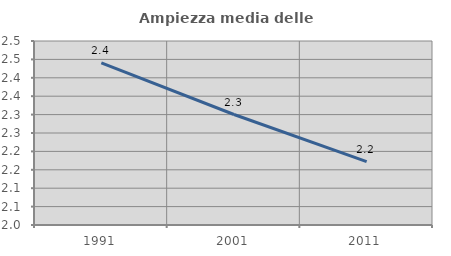
| Category | Ampiezza media delle famiglie |
|---|---|
| 1991.0 | 2.44 |
| 2001.0 | 2.3 |
| 2011.0 | 2.172 |